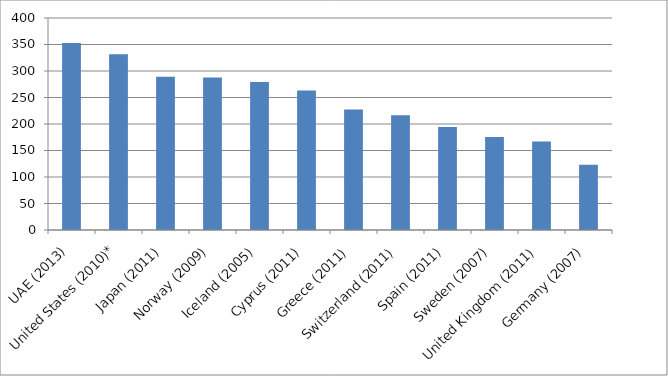
| Category | Series 0 |
|---|---|
| UAE (2013) | 353 |
| United States (2010)* | 331.37 |
| Japan (2011) | 289 |
| Norway (2009) | 287.67 |
| Iceland (2005) | 279.45 |
| Cyprus (2011) | 263.01 |
| Greece (2011) | 227.4 |
| Switzerland (2011) | 216.44 |
| Spain (2011) | 194.52 |
| Sweden (2007) | 175.34 |
| United Kingdom (2011) | 167.12 |
| Germany (2007) | 123.29 |